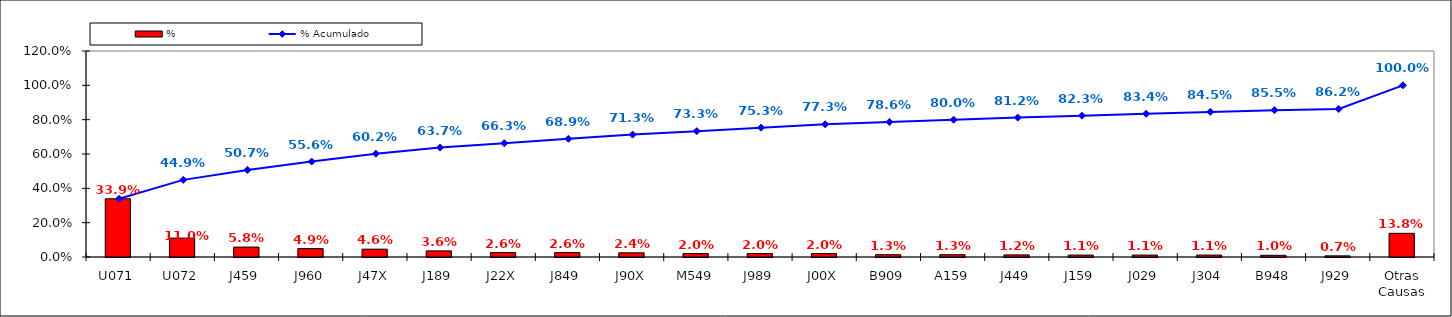
| Category | % |
|---|---|
| U071 | 0.339 |
| U072 | 0.11 |
| J459 | 0.058 |
| J960 | 0.049 |
| J47X | 0.046 |
| J189 | 0.036 |
| J22X | 0.026 |
| J849 | 0.026 |
| J90X | 0.024 |
| M549 | 0.02 |
| J989 | 0.02 |
| J00X | 0.02 |
| B909 | 0.013 |
| A159 | 0.013 |
| J449 | 0.012 |
| J159 | 0.011 |
| J029 | 0.011 |
| J304 | 0.011 |
| B948 | 0.01 |
| J929 | 0.007 |
| Otras Causas | 0.138 |